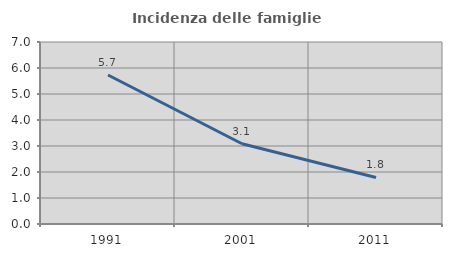
| Category | Incidenza delle famiglie numerose |
|---|---|
| 1991.0 | 5.732 |
| 2001.0 | 3.088 |
| 2011.0 | 1.79 |